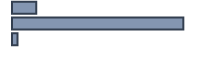
| Category | Series 0 |
|---|---|
| 0 | 12.081 |
| 1 | 85.241 |
| 2 | 2.678 |